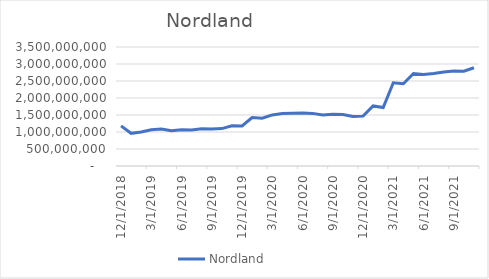
| Category | Nordland |
|---|---|
| 12/1/18 | 1179468666.667 |
| 1/1/19 | 961052416.667 |
| 2/1/19 | 997781583.333 |
| 3/1/19 | 1062864916.667 |
| 4/1/19 | 1085359083.333 |
| 5/1/19 | 1037794083.333 |
| 6/1/19 | 1063001583.333 |
| 7/1/19 | 1059797500 |
| 8/1/19 | 1095318333.333 |
| 9/1/19 | 1086576666.667 |
| 10/1/19 | 1099728333.333 |
| 11/1/19 | 1185070000 |
| 12/1/19 | 1178950833.333 |
| 1/1/20 | 1427198333.333 |
| 2/1/20 | 1404973333.333 |
| 3/1/20 | 1501615000 |
| 4/1/20 | 1542669166.667 |
| 5/1/20 | 1550059166.667 |
| 6/1/20 | 1562410833.333 |
| 7/1/20 | 1547465000 |
| 8/1/20 | 1503602500 |
| 9/1/20 | 1519840000 |
| 10/1/20 | 1514885833.333 |
| 11/1/20 | 1458090000 |
| 12/1/20 | 1466498333.333 |
| 1/1/21 | 1765496666.667 |
| 2/1/21 | 1718738333.333 |
| 3/1/21 | 2447442500 |
| 4/1/21 | 2418560833.333 |
| 5/1/21 | 2722252500 |
| 6/1/21 | 2693952500 |
| 7/1/21 | 2722269166.667 |
| 8/1/21 | 2764373333.333 |
| 9/1/21 | 2791290000 |
| 10/1/21 | 2788298333.333 |
| 11/1/21 | 2888702500 |